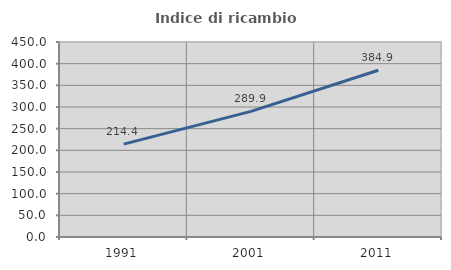
| Category | Indice di ricambio occupazionale  |
|---|---|
| 1991.0 | 214.377 |
| 2001.0 | 289.917 |
| 2011.0 | 384.9 |